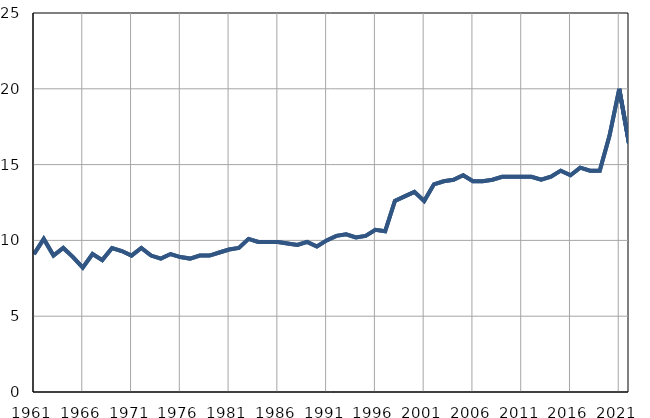
| Category |  РЕПУБЛИКА СРБИЈА |  Република Србија |
|---|---|---|
| 1961.0 | 9.1 | 9.1 |
| 1962.0 | 10.1 | 10.1 |
| 1963.0 | 9 | 9 |
| 1964.0 | 9.5 | 9.5 |
| 1965.0 | 8.9 | 8.9 |
| 1966.0 | 8.2 | 8.2 |
| 1967.0 | 9.1 | 9.1 |
| 1968.0 | 8.7 | 8.7 |
| 1969.0 | 9.5 | 9.5 |
| 1970.0 | 9.3 | 9.3 |
| 1971.0 | 9 | 9 |
| 1972.0 | 9.5 | 9.5 |
| 1973.0 | 9 | 9 |
| 1974.0 | 8.8 | 8.8 |
| 1975.0 | 9.1 | 9.1 |
| 1976.0 | 8.9 | 8.9 |
| 1977.0 | 8.8 | 8.8 |
| 1978.0 | 9 | 9 |
| 1979.0 | 9 | 9 |
| 1980.0 | 9.2 | 9.2 |
| 1981.0 | 9.4 | 9.4 |
| 1982.0 | 9.5 | 9.5 |
| 1983.0 | 10.1 | 10.1 |
| 1984.0 | 9.9 | 9.9 |
| 1985.0 | 9.9 | 9.9 |
| 1986.0 | 9.9 | 9.9 |
| 1987.0 | 9.8 | 9.8 |
| 1988.0 | 9.7 | 9.7 |
| 1989.0 | 9.9 | 9.9 |
| 1990.0 | 9.6 | 9.6 |
| 1991.0 | 10 | 10 |
| 1992.0 | 10.3 | 10.3 |
| 1993.0 | 10.4 | 10.4 |
| 1994.0 | 10.2 | 10.2 |
| 1995.0 | 10.3 | 10.3 |
| 1996.0 | 10.7 | 10.7 |
| 1997.0 | 10.6 | 10.6 |
| 1998.0 | 12.6 | 12.6 |
| 1999.0 | 12.9 | 12.9 |
| 2000.0 | 13.2 | 13.2 |
| 2001.0 | 12.6 | 12.6 |
| 2002.0 | 13.7 | 13.7 |
| 2003.0 | 13.9 | 13.9 |
| 2004.0 | 14 | 14 |
| 2005.0 | 14.3 | 14.3 |
| 2006.0 | 13.9 | 13.9 |
| 2007.0 | 13.9 | 13.9 |
| 2008.0 | 14 | 14 |
| 2009.0 | 14.2 | 14.2 |
| 2010.0 | 14.2 | 14.2 |
| 2011.0 | 14.2 | 14.2 |
| 2012.0 | 14.2 | 14.2 |
| 2013.0 | 14 | 14 |
| 2014.0 | 14.2 | 14.2 |
| 2015.0 | 14.6 | 14.6 |
| 2016.0 | 14.3 | 14.3 |
| 2017.0 | 14.8 | 14.8 |
| 2018.0 | 14.6 | 14.6 |
| 2019.0 | 14.6 | 14.6 |
| 2020.0 | 16.9 | 16.9 |
| 2021.0 | 20 | 20 |
| 2022.0 | 16.4 | 16.4 |